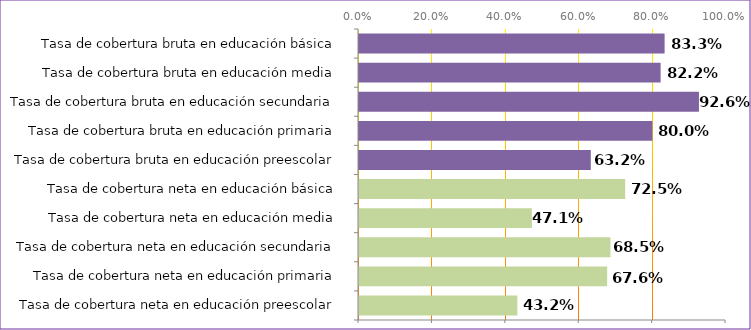
| Category | Series 0 |
|---|---|
| Tasa de cobertura neta en educación preescolar | 0.432 |
| Tasa de cobertura neta en educación primaria | 0.676 |
| Tasa de cobertura neta en educación secundaria | 0.685 |
| Tasa de cobertura neta en educación media | 0.471 |
| Tasa de cobertura neta en educación básica | 0.725 |
| Tasa de cobertura bruta en educación preescolar | 0.632 |
| Tasa de cobertura bruta en educación primaria | 0.8 |
| Tasa de cobertura bruta en educación secundaria | 0.926 |
| Tasa de cobertura bruta en educación media | 0.822 |
| Tasa de cobertura bruta en educación básica | 0.833 |